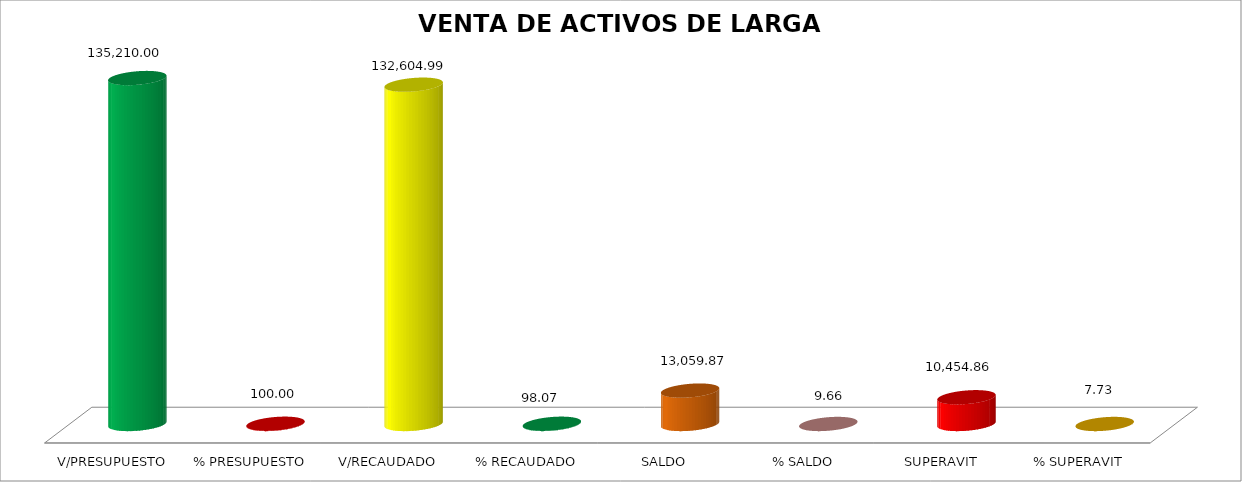
| Category | VENTA DE ACTIVOS DE LARGA DURACIÓN |
|---|---|
| V/PRESUPUESTO | 135210 |
| % PRESUPUESTO | 100 |
| V/RECAUDADO | 132604.99 |
| % RECAUDADO | 98.073 |
| SALDO | 13059.87 |
| % SALDO | 9.659 |
| SUPERAVIT | 10454.86 |
| % SUPERAVIT | 7.732 |